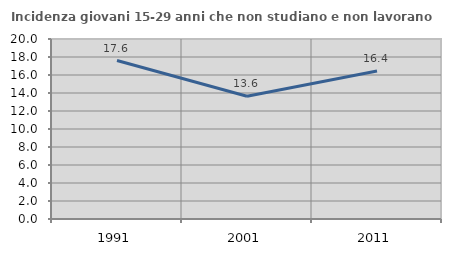
| Category | Incidenza giovani 15-29 anni che non studiano e non lavorano  |
|---|---|
| 1991.0 | 17.609 |
| 2001.0 | 13.641 |
| 2011.0 | 16.44 |